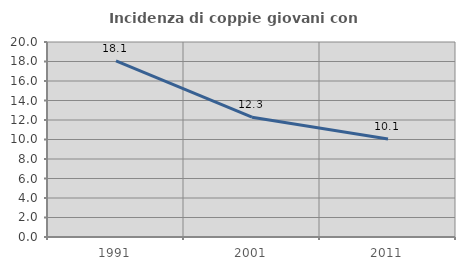
| Category | Incidenza di coppie giovani con figli |
|---|---|
| 1991.0 | 18.065 |
| 2001.0 | 12.287 |
| 2011.0 | 10.055 |